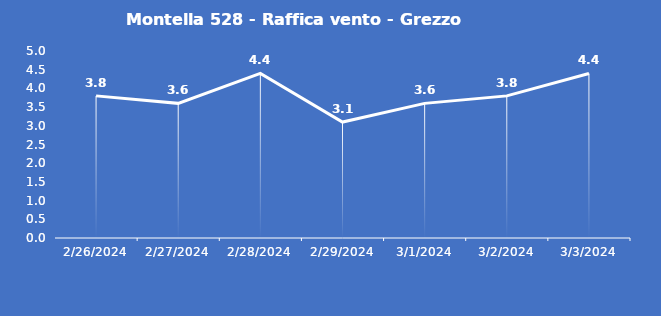
| Category | Montella 528 - Raffica vento - Grezzo (m/s) |
|---|---|
| 2/26/24 | 3.8 |
| 2/27/24 | 3.6 |
| 2/28/24 | 4.4 |
| 2/29/24 | 3.1 |
| 3/1/24 | 3.6 |
| 3/2/24 | 3.8 |
| 3/3/24 | 4.4 |